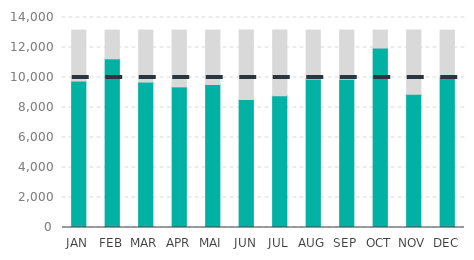
| Category | Actual | Max |
|---|---|---|
| JAN | 9764 | 3396.4 |
| FEB | 11245 | 1915.4 |
| MAR | 9696 | 3464.4 |
| APR | 9374 | 3786.4 |
| MAI | 9533 | 3627.4 |
| JUN | 8531 | 4629.4 |
| JUL | 8781 | 4379.4 |
| AUG | 9892 | 3268.4 |
| SEP | 9882 | 3278.4 |
| OCT | 11964 | 1196.4 |
| NOV | 8883 | 4277.4 |
| DEC | 10023 | 3137.4 |